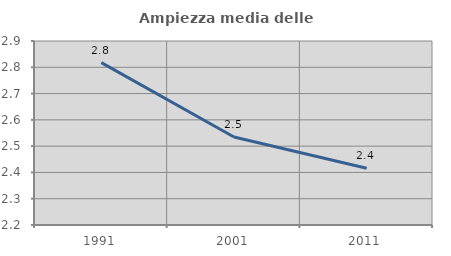
| Category | Ampiezza media delle famiglie |
|---|---|
| 1991.0 | 2.818 |
| 2001.0 | 2.535 |
| 2011.0 | 2.416 |